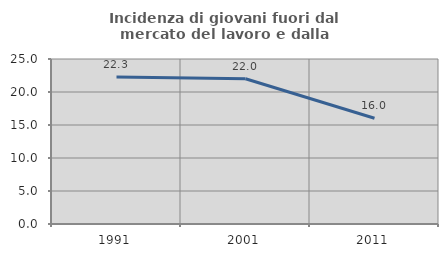
| Category | Incidenza di giovani fuori dal mercato del lavoro e dalla formazione  |
|---|---|
| 1991.0 | 22.254 |
| 2001.0 | 22.008 |
| 2011.0 | 16.022 |